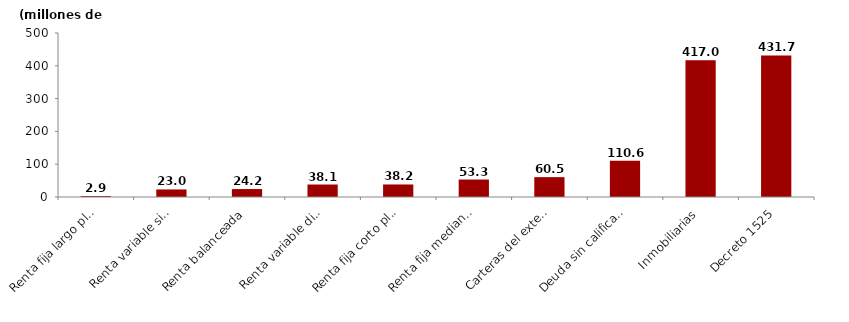
| Category | Series 0 |
|---|---|
| Renta fija largo plazo | 2.85 |
| Renta variable sin diversificación | 22.976 |
| Renta balanceada | 24.194 |
| Renta variable diversificada | 38.056 |
| Renta fija corto plazo | 38.177 |
| Renta fija mediano plazo | 53.293 |
| Carteras del exterior | 60.531 |
| Deuda sin calificación | 110.579 |
| Inmobiliarias | 417.017 |
| Decreto 1525 | 431.672 |